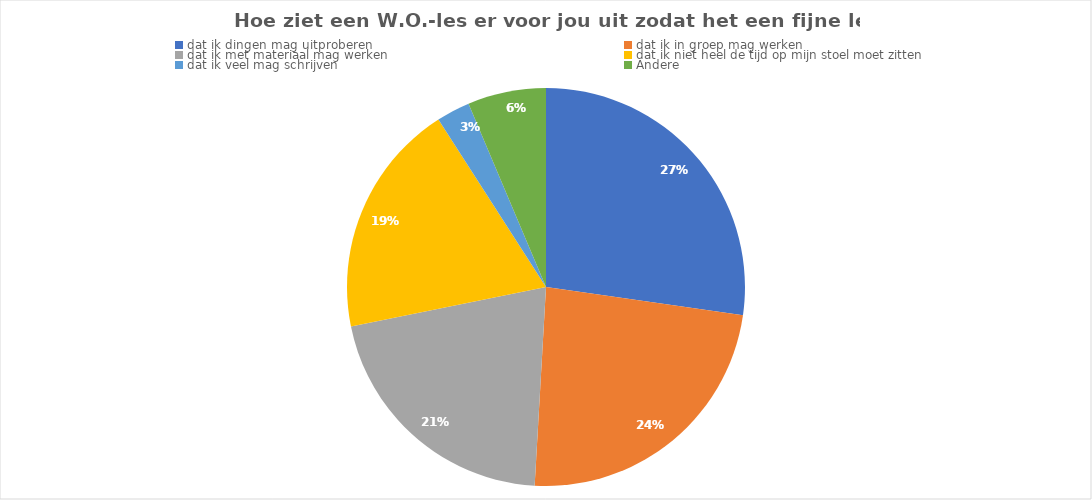
| Category | Aantal leerlingen |
|---|---|
| dat ik dingen mag uitproberen | 30 |
| dat ik in groep mag werken | 26 |
| dat ik met materiaal mag werken | 23 |
| dat ik niet heel de tijd op mijn stoel moet zitten | 21 |
| dat ik veel mag schrijven | 3 |
| Andere | 7 |